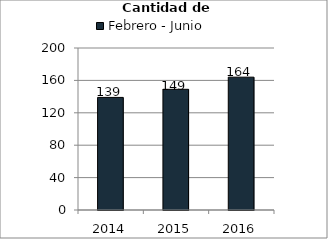
| Category | Febrero - Junio |
|---|---|
| 2014.0 | 139 |
| 2015.0 | 149 |
| 2016.0 | 164 |